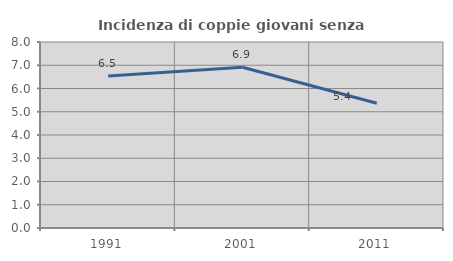
| Category | Incidenza di coppie giovani senza figli |
|---|---|
| 1991.0 | 6.538 |
| 2001.0 | 6.914 |
| 2011.0 | 5.364 |